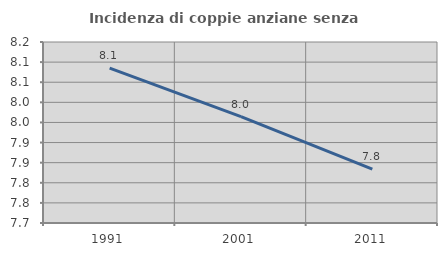
| Category | Incidenza di coppie anziane senza figli  |
|---|---|
| 1991.0 | 8.085 |
| 2001.0 | 7.965 |
| 2011.0 | 7.834 |